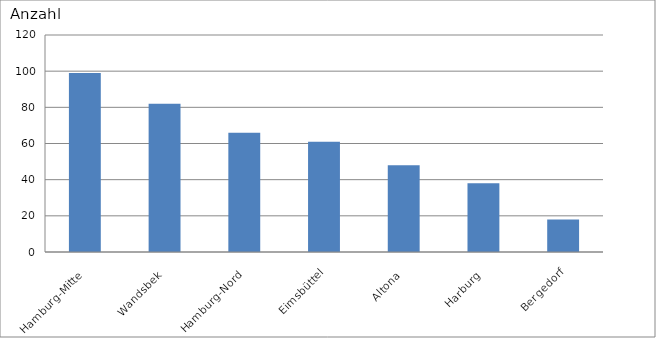
| Category | Hamburg-Mitte |
|---|---|
| Hamburg-Mitte | 99 |
| Wandsbek | 82 |
| Hamburg-Nord | 66 |
| Eimsbüttel | 61 |
| Altona | 48 |
| Harburg | 38 |
| Bergedorf | 18 |